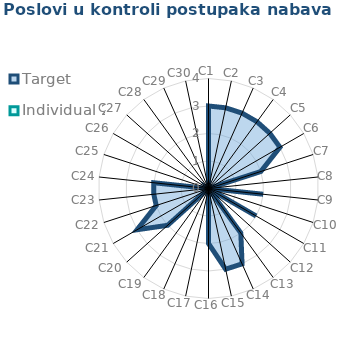
| Category | Target | Individual 2 |
|---|---|---|
| C1 | 3 | 0 |
| C2 | 3 | 0 |
| C3 | 3 | 0 |
| C4 | 3 | 0 |
| C5 | 3 | 0 |
| C6 | 3 | 0 |
| C7 | 2 | 0 |
| C8 | 0 | 0 |
| C9 | 2 | 0 |
| C10 | 0 | 0 |
| C11 | 2 | 0 |
| C12 | 0 | 0 |
| C13 | 2 | 0 |
| C14 | 3 | 0 |
| C15 | 3 | 0 |
| C16 | 2 | 0 |
| C17 | 0 | 0 |
| C18 | 0 | 0 |
| C19 | 0 | 0 |
| C20 | 2 | 0 |
| C21 | 3 | 0 |
| C22 | 2 | 0 |
| C23 | 2 | 0 |
| C24 | 2 | 0 |
| C25 | 0 | 0 |
| C26 | 0 | 0 |
| C27 | 0 | 0 |
| C28 | 0 | 0 |
| C29 | 0 | 0 |
| C30 | 0 | 0 |